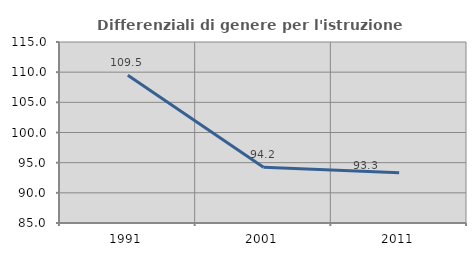
| Category | Differenziali di genere per l'istruzione superiore |
|---|---|
| 1991.0 | 109.494 |
| 2001.0 | 94.227 |
| 2011.0 | 93.328 |